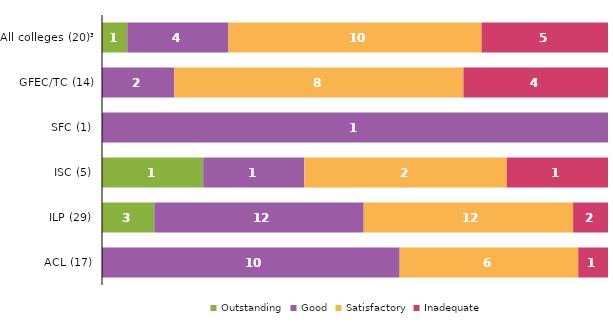
| Category | Outstanding | Good | Satisfactory | Inadequate |
|---|---|---|---|---|
| All colleges (20)³ | 1 | 4 | 10 | 5 |
| GFEC/TC (14) | 0 | 2 | 8 | 4 |
| SFC (1) | 0 | 1 | 0 | 0 |
| ISC (5) | 1 | 1 | 2 | 1 |
| ILP (29) | 3 | 12 | 12 | 2 |
| ACL (17) | 0 | 10 | 6 | 1 |